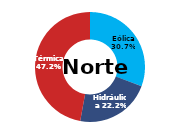
| Category | Norte |
|---|---|
| Eólica | 95.044 |
| Hidráulica | 68.757 |
| Solar | 0 |
| Térmica | 146.142 |